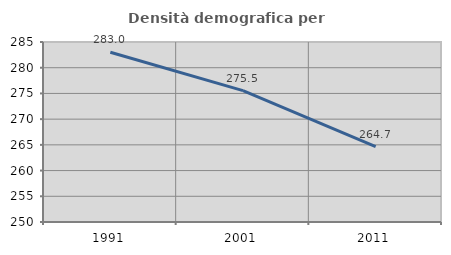
| Category | Densità demografica |
|---|---|
| 1991.0 | 282.996 |
| 2001.0 | 275.546 |
| 2011.0 | 264.669 |